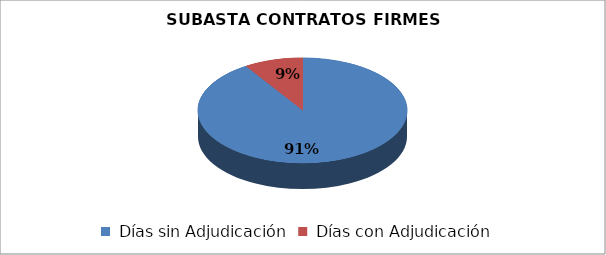
| Category | Series 0 |
|---|---|
| Días sin Adjudicación | 10 |
| Días con Adjudicación | 1 |